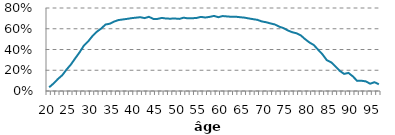
| Category | Series 0 |
|---|---|
| 20.0 | 0.035 |
| 21.0 | 0.072 |
| 22.0 | 0.115 |
| 23.0 | 0.151 |
| 24.0 | 0.206 |
| 25.0 | 0.255 |
| 26.0 | 0.314 |
| 27.0 | 0.372 |
| 28.0 | 0.437 |
| 29.0 | 0.479 |
| 30.0 | 0.53 |
| 31.0 | 0.571 |
| 32.0 | 0.602 |
| 33.0 | 0.641 |
| 34.0 | 0.649 |
| 35.0 | 0.67 |
| 36.0 | 0.684 |
| 37.0 | 0.69 |
| 38.0 | 0.695 |
| 39.0 | 0.702 |
| 40.0 | 0.707 |
| 41.0 | 0.711 |
| 42.0 | 0.703 |
| 43.0 | 0.715 |
| 44.0 | 0.695 |
| 45.0 | 0.695 |
| 46.0 | 0.705 |
| 47.0 | 0.698 |
| 48.0 | 0.697 |
| 49.0 | 0.699 |
| 50.0 | 0.695 |
| 51.0 | 0.707 |
| 52.0 | 0.7 |
| 53.0 | 0.701 |
| 54.0 | 0.704 |
| 55.0 | 0.714 |
| 56.0 | 0.708 |
| 57.0 | 0.715 |
| 58.0 | 0.724 |
| 59.0 | 0.711 |
| 60.0 | 0.722 |
| 61.0 | 0.719 |
| 62.0 | 0.715 |
| 63.0 | 0.716 |
| 64.0 | 0.711 |
| 65.0 | 0.707 |
| 66.0 | 0.7 |
| 67.0 | 0.692 |
| 68.0 | 0.686 |
| 69.0 | 0.671 |
| 70.0 | 0.663 |
| 71.0 | 0.652 |
| 72.0 | 0.642 |
| 73.0 | 0.621 |
| 74.0 | 0.607 |
| 75.0 | 0.584 |
| 76.0 | 0.567 |
| 77.0 | 0.557 |
| 78.0 | 0.536 |
| 79.0 | 0.5 |
| 80.0 | 0.468 |
| 81.0 | 0.443 |
| 82.0 | 0.398 |
| 83.0 | 0.354 |
| 84.0 | 0.297 |
| 85.0 | 0.277 |
| 86.0 | 0.237 |
| 87.0 | 0.194 |
| 88.0 | 0.165 |
| 89.0 | 0.174 |
| 90.0 | 0.141 |
| 91.0 | 0.098 |
| 92.0 | 0.099 |
| 93.0 | 0.093 |
| 94.0 | 0.07 |
| 95.0 | 0.085 |